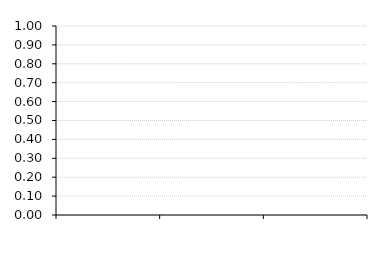
| Category | Current Ratio |
|---|---|
| 0 | 0 |
| 1 | 0 |
| 2 | 0 |